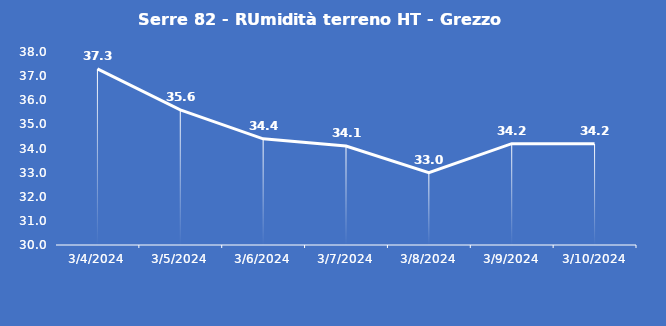
| Category | Serre 82 - RUmidità terreno HT - Grezzo (%VWC) |
|---|---|
| 3/4/24 | 37.3 |
| 3/5/24 | 35.6 |
| 3/6/24 | 34.4 |
| 3/7/24 | 34.1 |
| 3/8/24 | 33 |
| 3/9/24 | 34.2 |
| 3/10/24 | 34.2 |